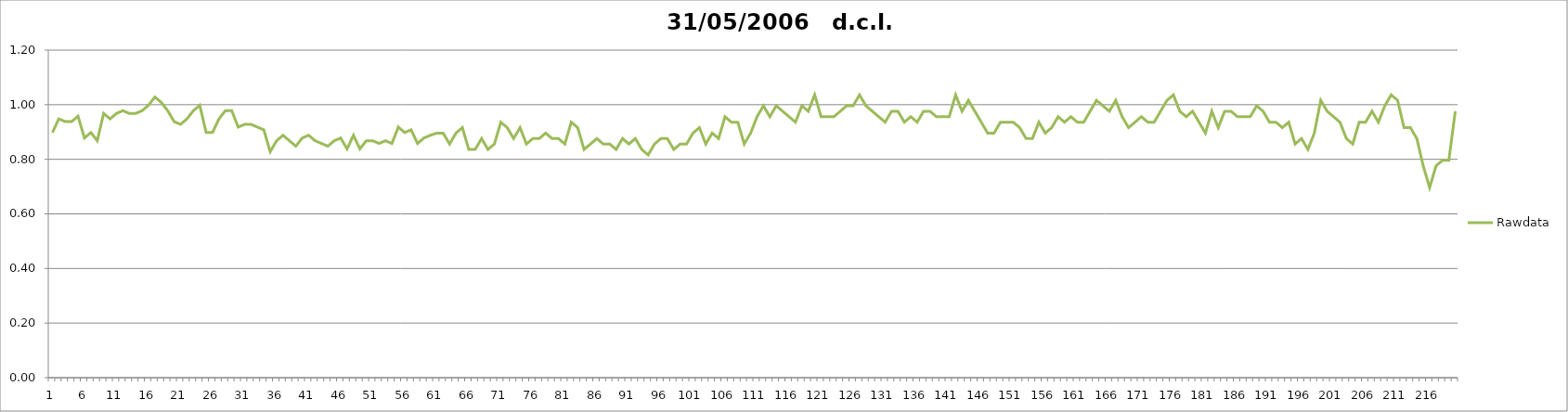
| Category | Rawdata |
|---|---|
| 0 | 0.898 |
| 1 | 0.948 |
| 2 | 0.938 |
| 3 | 0.938 |
| 4 | 0.958 |
| 5 | 0.878 |
| 6 | 0.898 |
| 7 | 0.868 |
| 8 | 0.968 |
| 9 | 0.948 |
| 10 | 0.968 |
| 11 | 0.978 |
| 12 | 0.968 |
| 13 | 0.968 |
| 14 | 0.978 |
| 15 | 0.998 |
| 16 | 1.028 |
| 17 | 1.008 |
| 18 | 0.978 |
| 19 | 0.938 |
| 20 | 0.928 |
| 21 | 0.948 |
| 22 | 0.978 |
| 23 | 0.998 |
| 24 | 0.898 |
| 25 | 0.898 |
| 26 | 0.948 |
| 27 | 0.978 |
| 28 | 0.978 |
| 29 | 0.918 |
| 30 | 0.928 |
| 31 | 0.928 |
| 32 | 0.918 |
| 33 | 0.908 |
| 34 | 0.828 |
| 35 | 0.868 |
| 36 | 0.888 |
| 37 | 0.868 |
| 38 | 0.848 |
| 39 | 0.878 |
| 40 | 0.888 |
| 41 | 0.868 |
| 42 | 0.858 |
| 43 | 0.848 |
| 44 | 0.868 |
| 45 | 0.878 |
| 46 | 0.838 |
| 47 | 0.888 |
| 48 | 0.838 |
| 49 | 0.868 |
| 50 | 0.868 |
| 51 | 0.858 |
| 52 | 0.868 |
| 53 | 0.858 |
| 54 | 0.918 |
| 55 | 0.898 |
| 56 | 0.908 |
| 57 | 0.858 |
| 58 | 0.878 |
| 59 | 0.888 |
| 60 | 0.896 |
| 61 | 0.896 |
| 62 | 0.856 |
| 63 | 0.896 |
| 64 | 0.916 |
| 65 | 0.836 |
| 66 | 0.836 |
| 67 | 0.876 |
| 68 | 0.836 |
| 69 | 0.856 |
| 70 | 0.936 |
| 71 | 0.916 |
| 72 | 0.876 |
| 73 | 0.916 |
| 74 | 0.856 |
| 75 | 0.876 |
| 76 | 0.876 |
| 77 | 0.896 |
| 78 | 0.876 |
| 79 | 0.876 |
| 80 | 0.856 |
| 81 | 0.936 |
| 82 | 0.916 |
| 83 | 0.836 |
| 84 | 0.856 |
| 85 | 0.876 |
| 86 | 0.856 |
| 87 | 0.856 |
| 88 | 0.836 |
| 89 | 0.876 |
| 90 | 0.856 |
| 91 | 0.876 |
| 92 | 0.836 |
| 93 | 0.816 |
| 94 | 0.856 |
| 95 | 0.876 |
| 96 | 0.876 |
| 97 | 0.836 |
| 98 | 0.856 |
| 99 | 0.856 |
| 100 | 0.896 |
| 101 | 0.916 |
| 102 | 0.856 |
| 103 | 0.896 |
| 104 | 0.876 |
| 105 | 0.956 |
| 106 | 0.936 |
| 107 | 0.936 |
| 108 | 0.856 |
| 109 | 0.896 |
| 110 | 0.956 |
| 111 | 0.996 |
| 112 | 0.956 |
| 113 | 0.996 |
| 114 | 0.976 |
| 115 | 0.956 |
| 116 | 0.936 |
| 117 | 0.996 |
| 118 | 0.976 |
| 119 | 1.036 |
| 120 | 0.956 |
| 121 | 0.956 |
| 122 | 0.956 |
| 123 | 0.976 |
| 124 | 0.996 |
| 125 | 0.996 |
| 126 | 1.036 |
| 127 | 0.996 |
| 128 | 0.976 |
| 129 | 0.956 |
| 130 | 0.936 |
| 131 | 0.976 |
| 132 | 0.976 |
| 133 | 0.936 |
| 134 | 0.956 |
| 135 | 0.936 |
| 136 | 0.976 |
| 137 | 0.976 |
| 138 | 0.956 |
| 139 | 0.956 |
| 140 | 0.956 |
| 141 | 1.036 |
| 142 | 0.976 |
| 143 | 1.016 |
| 144 | 0.976 |
| 145 | 0.936 |
| 146 | 0.896 |
| 147 | 0.896 |
| 148 | 0.936 |
| 149 | 0.936 |
| 150 | 0.936 |
| 151 | 0.916 |
| 152 | 0.876 |
| 153 | 0.876 |
| 154 | 0.936 |
| 155 | 0.896 |
| 156 | 0.916 |
| 157 | 0.956 |
| 158 | 0.936 |
| 159 | 0.956 |
| 160 | 0.936 |
| 161 | 0.936 |
| 162 | 0.976 |
| 163 | 1.016 |
| 164 | 0.996 |
| 165 | 0.976 |
| 166 | 1.016 |
| 167 | 0.956 |
| 168 | 0.916 |
| 169 | 0.936 |
| 170 | 0.956 |
| 171 | 0.936 |
| 172 | 0.936 |
| 173 | 0.976 |
| 174 | 1.016 |
| 175 | 1.036 |
| 176 | 0.976 |
| 177 | 0.956 |
| 178 | 0.976 |
| 179 | 0.936 |
| 180 | 0.896 |
| 181 | 0.976 |
| 182 | 0.916 |
| 183 | 0.976 |
| 184 | 0.976 |
| 185 | 0.956 |
| 186 | 0.956 |
| 187 | 0.956 |
| 188 | 0.996 |
| 189 | 0.976 |
| 190 | 0.936 |
| 191 | 0.936 |
| 192 | 0.916 |
| 193 | 0.936 |
| 194 | 0.856 |
| 195 | 0.876 |
| 196 | 0.836 |
| 197 | 0.896 |
| 198 | 1.016 |
| 199 | 0.976 |
| 200 | 0.956 |
| 201 | 0.936 |
| 202 | 0.876 |
| 203 | 0.856 |
| 204 | 0.936 |
| 205 | 0.936 |
| 206 | 0.976 |
| 207 | 0.936 |
| 208 | 0.996 |
| 209 | 1.036 |
| 210 | 1.016 |
| 211 | 0.916 |
| 212 | 0.916 |
| 213 | 0.876 |
| 214 | 0.776 |
| 215 | 0.696 |
| 216 | 0.776 |
| 217 | 0.796 |
| 218 | 0.796 |
| 219 | 0.976 |